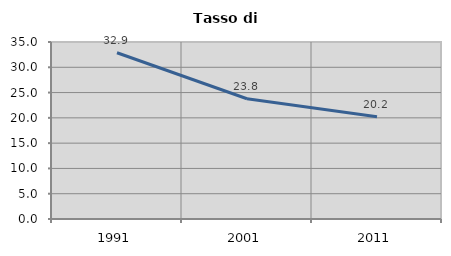
| Category | Tasso di disoccupazione   |
|---|---|
| 1991.0 | 32.868 |
| 2001.0 | 23.779 |
| 2011.0 | 20.219 |